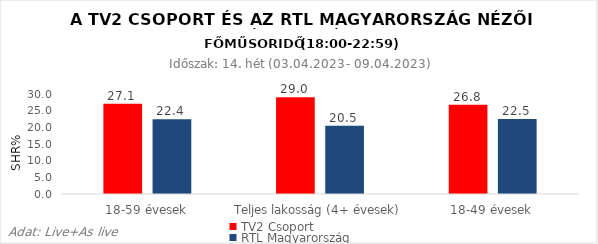
| Category | TV2 Csoport | RTL Magyarország |
|---|---|---|
| 18-59 évesek | 27.1 | 22.4 |
| Teljes lakosság (4+ évesek) | 29 | 20.5 |
| 18-49 évesek | 26.8 | 22.5 |